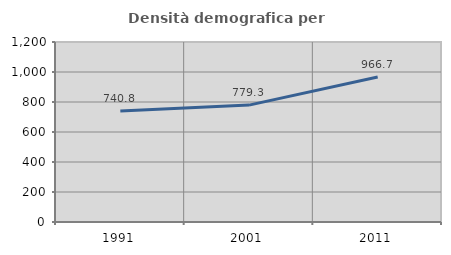
| Category | Densità demografica |
|---|---|
| 1991.0 | 740.793 |
| 2001.0 | 779.252 |
| 2011.0 | 966.716 |